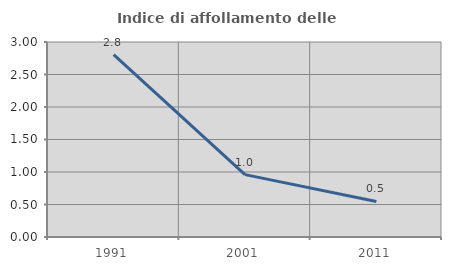
| Category | Indice di affollamento delle abitazioni  |
|---|---|
| 1991.0 | 2.806 |
| 2001.0 | 0.96 |
| 2011.0 | 0.547 |